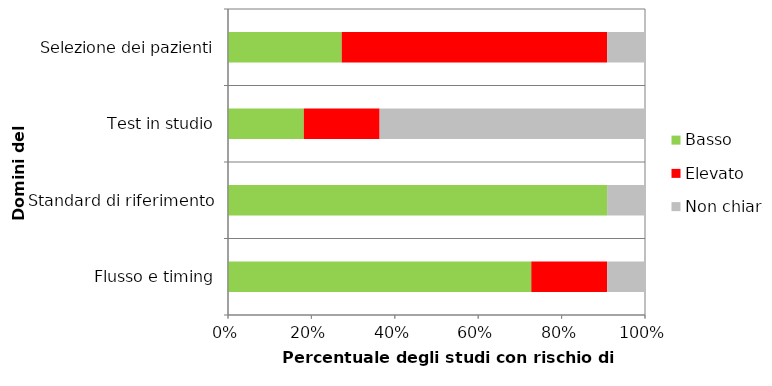
| Category | Basso | Elevato | Non chiaro |
|---|---|---|---|
| Selezione dei pazienti | 3 | 7 | 1 |
| Test in studio | 2 | 2 | 7 |
| Standard di riferimento | 10 | 0 | 1 |
| Flusso e timing | 8 | 2 | 1 |